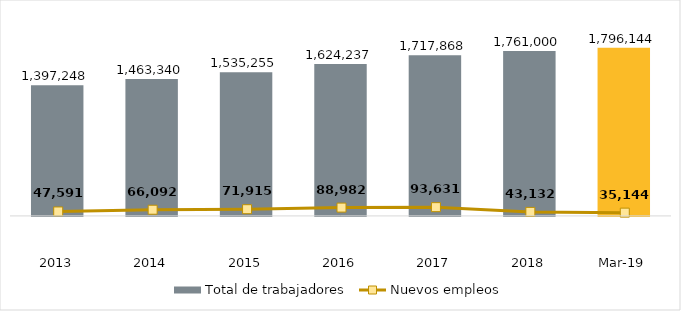
| Category | Total de trabajadores |
|---|---|
| 2013.0 | 1397248 |
| 2014.0 | 1463340 |
| 2015.0 | 1535255 |
| 2016.0 | 1624237 |
| 2017.0 | 1717868 |
| 2018.0 | 1761000 |
| 43525.0 | 1796144 |